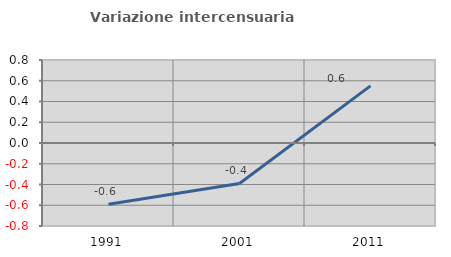
| Category | Variazione intercensuaria annua |
|---|---|
| 1991.0 | -0.591 |
| 2001.0 | -0.39 |
| 2011.0 | 0.551 |